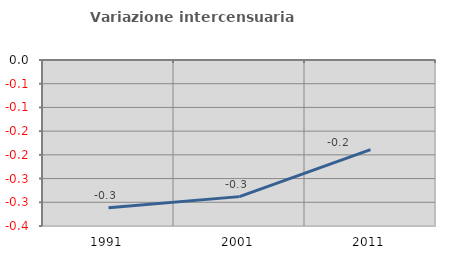
| Category | Variazione intercensuaria annua |
|---|---|
| 1991.0 | -0.311 |
| 2001.0 | -0.288 |
| 2011.0 | -0.189 |